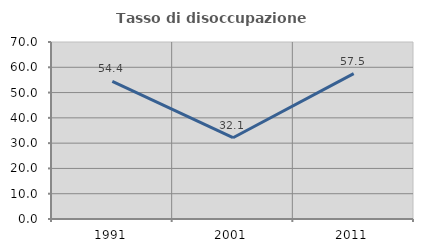
| Category | Tasso di disoccupazione giovanile  |
|---|---|
| 1991.0 | 54.412 |
| 2001.0 | 32.143 |
| 2011.0 | 57.5 |